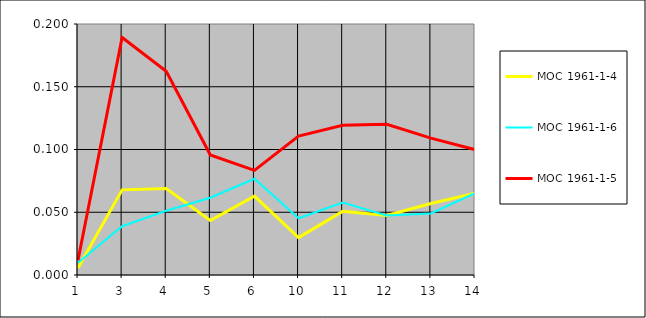
| Category | MOC 1961-1-4 | MOC 1961-1-6 | MOC 1961-1-5 |
|---|---|---|---|
| 1.0 | 0.006 | 0.01 | 0.012 |
| 3.0 | 0.068 | 0.039 | 0.189 |
| 4.0 | 0.069 | 0.051 | 0.162 |
| 5.0 | 0.043 | 0.062 | 0.096 |
| 6.0 | 0.063 | 0.077 | 0.083 |
| 10.0 | 0.03 | 0.045 | 0.111 |
| 11.0 | 0.051 | 0.058 | 0.119 |
| 12.0 | 0.047 | 0.047 | 0.12 |
| 13.0 | 0.057 | 0.049 | 0.109 |
| 14.0 | 0.065 | 0.065 | 0.1 |